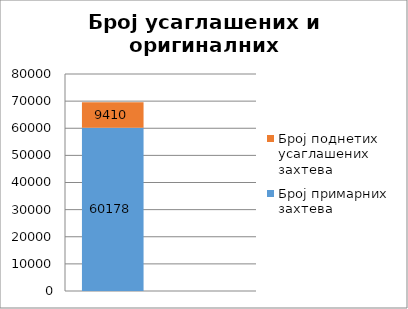
| Category | Број примарних захтева | Број поднетих усаглашених захтева |
|---|---|---|
| 0 | 60178 | 9410 |
| 1 | 0.865 | 0.135 |